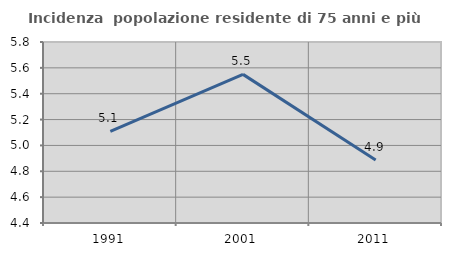
| Category | Incidenza  popolazione residente di 75 anni e più |
|---|---|
| 1991.0 | 5.109 |
| 2001.0 | 5.55 |
| 2011.0 | 4.888 |